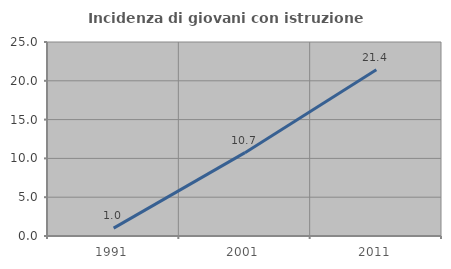
| Category | Incidenza di giovani con istruzione universitaria |
|---|---|
| 1991.0 | 1.02 |
| 2001.0 | 10.738 |
| 2011.0 | 21.429 |